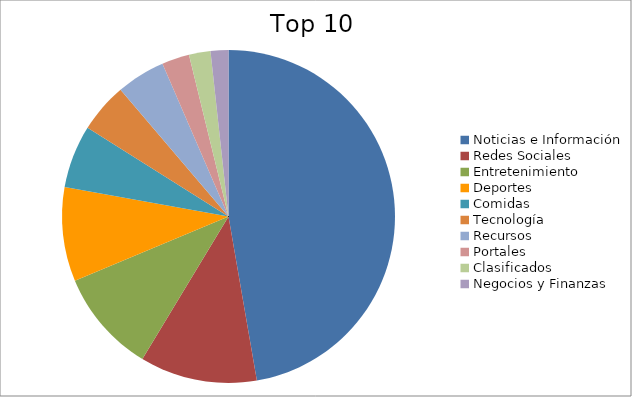
| Category | Series 0 |
|---|---|
| Noticias e Información | 44.58 |
| Redes Sociales | 10.73 |
| Entretenimiento | 9.47 |
| Deportes | 8.61 |
| Comidas | 5.76 |
| Tecnología | 4.56 |
| Recursos | 4.47 |
| Portales | 2.52 |
| Clasificados | 1.97 |
| Negocios y Finanzas | 1.63 |